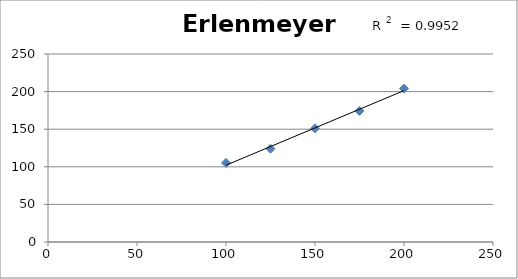
| Category | Mass of Water (g) |
|---|---|
| 100.0 | 105.12 |
| 125.0 | 124.02 |
| 150.0 | 151.14 |
| 175.0 | 174.31 |
| 200.0 | 204.01 |